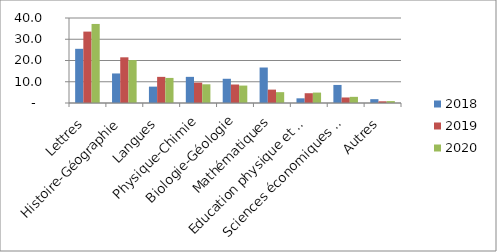
| Category | 2018 | 2019 | 2020 |
|---|---|---|---|
| Lettres | 25.5 | 33.6 | 37.2 |
| Histoire-Géographie | 13.9 | 21.5 | 20.2 |
| Langues | 7.7 | 12.3 | 11.8 |
| Physique-Chimie | 12.3 | 9.6 | 8.8 |
| Biologie-Géologie | 11.4 | 8.7 | 8.2 |
| Mathématiques | 16.7 | 6.3 | 5.1 |
| Education physique et sportive | 2.2 | 4.6 | 4.9 |
| Sciences économiques et sociales | 8.5 | 2.6 | 2.9 |
| Autres | 1.8 | 0.8 | 0.9 |